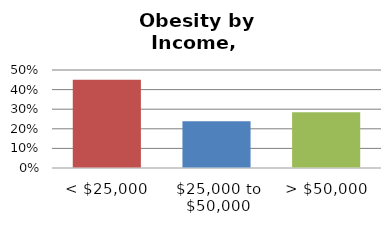
| Category | Series 0 |
|---|---|
| < $25,000 | 0.45 |
| $25,000 to $50,000 | 0.238 |
| > $50,000 | 0.285 |